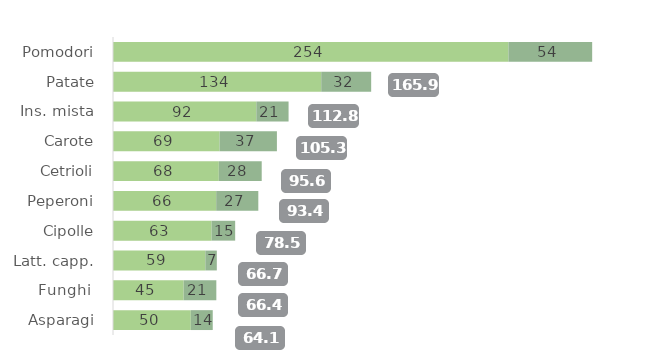
| Category | Non bio | Bio |
|---|---|---|
| Pomodori | 254.079 | 53.825 |
| Patate | 133.807 | 32.092 |
| Ins. mista | 92.085 | 20.733 |
| Carote | 68.507 | 36.816 |
| Cetrioli | 67.995 | 27.566 |
| Peperoni | 66.296 | 27.081 |
| Cipolle | 63.372 | 15.134 |
| Latt. capp. | 59.333 | 7.371 |
| Funghi  | 45.402 | 20.999 |
| Asparagi | 49.981 | 14.111 |